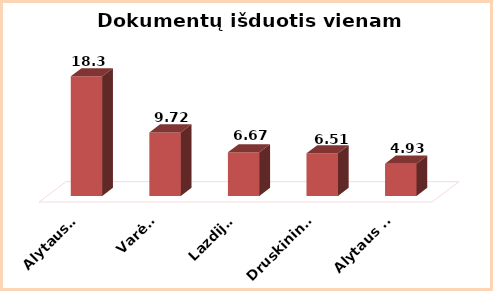
| Category | Series 0 |
|---|---|
| Alytaus r. | 18.3 |
| Varėna | 9.72 |
| Lazdijai | 6.67 |
| Druskininkai | 6.51 |
| Alytaus m. | 4.93 |